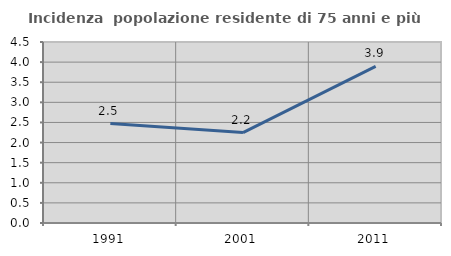
| Category | Incidenza  popolazione residente di 75 anni e più |
|---|---|
| 1991.0 | 2.474 |
| 2001.0 | 2.248 |
| 2011.0 | 3.894 |